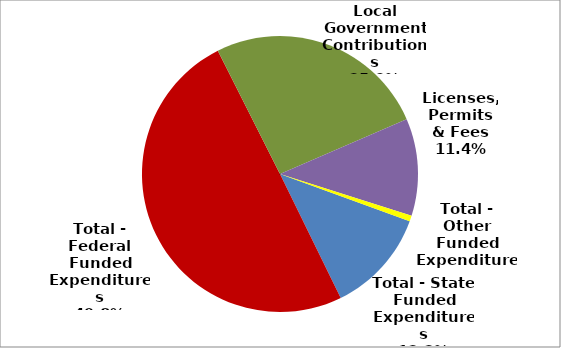
| Category | Series 0 |
|---|---|
| Total - State Funded Expenditures | 345998 |
| Total - Federal Funded Expenditures | 1413404 |
| Local Government Contributions | 735942 |
| Licenses, Permits & Fees | 322928 |
| Total - Other Funded Expenditures | 19239 |